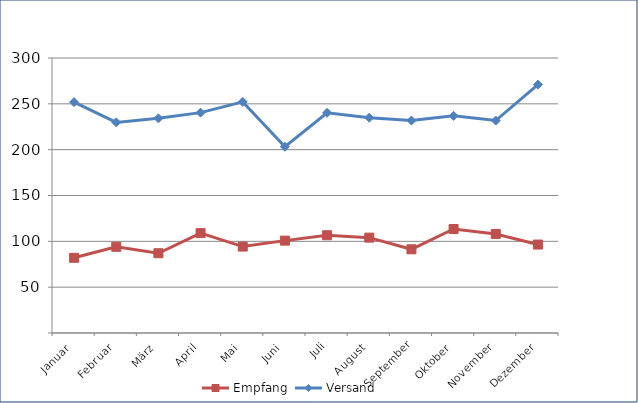
| Category | Empfang | Versand |
|---|---|---|
| Januar | 82.045 | 251.859 |
| Februar | 94.025 | 229.767 |
| März | 87.018 | 234.172 |
| April | 108.951 | 240.418 |
| Mai | 94.287 | 252.129 |
| Juni | 100.774 | 203.194 |
| Juli | 106.625 | 240.202 |
| August | 104.041 | 234.893 |
| September | 91.304 | 231.768 |
| Oktober | 113.467 | 236.88 |
| November | 108.075 | 231.782 |
| Dezember | 96.488 | 270.933 |